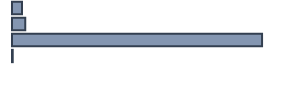
| Category | Series 0 |
|---|---|
| 0 | 3.667 |
| 1 | 4.806 |
| 2 | 91.262 |
| 3 | 0.264 |
| 4 | 0 |